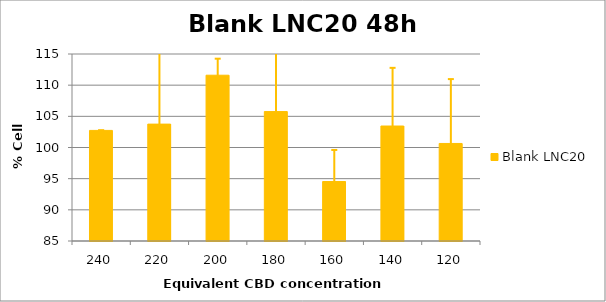
| Category | Blank LNC20 |
|---|---|
| 240.0 | 102.741 |
| 220.0 | 103.752 |
| 200.0 | 111.597 |
| 180.0 | 105.763 |
| 160.0 | 94.539 |
| 140.0 | 103.445 |
| 120.0 | 100.649 |